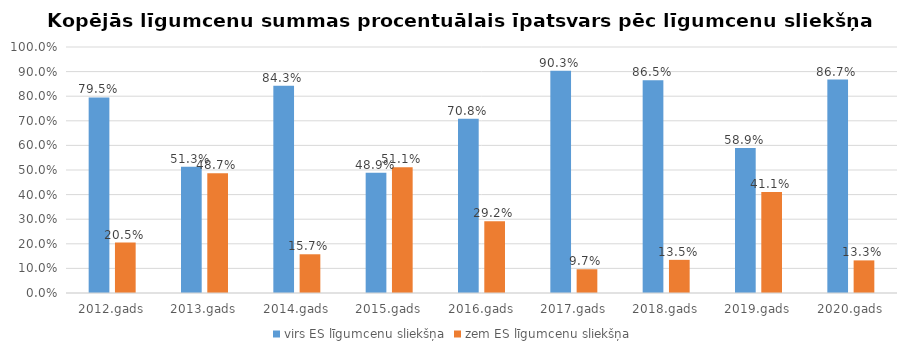
| Category | virs ES līgumcenu sliekšņa | zem ES līgumcenu sliekšņa |
|---|---|---|
| 2012.gads | 0.795 | 0.205 |
| 2013.gads | 0.513 | 0.487 |
| 2014.gads | 0.843 | 0.157 |
| 2015.gads | 0.489 | 0.511 |
| 2016.gads | 0.708 | 0.292 |
| 2017.gads | 0.903 | 0.097 |
| 2018.gads | 0.865 | 0.135 |
| 2019.gads | 0.589 | 0.411 |
| 2020.gads | 0.867 | 0.133 |